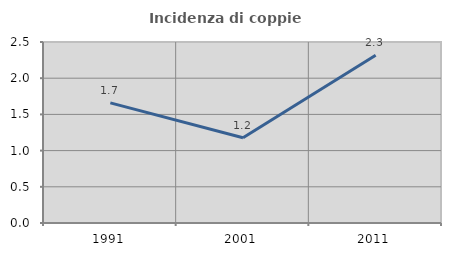
| Category | Incidenza di coppie miste |
|---|---|
| 1991.0 | 1.66 |
| 2001.0 | 1.176 |
| 2011.0 | 2.317 |